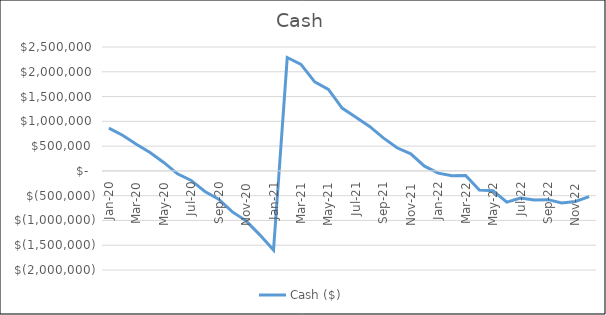
| Category | Cash ($) |
|---|---|
| 2020-01-01 | 863731.25 |
| 2020-02-29 | 720348.125 |
| 2020-03-31 | 537153.082 |
| 2020-04-30 | 370341.601 |
| 2020-05-31 | 171082.808 |
| 2020-06-30 | -59057.423 |
| 2020-07-31 | -192175.591 |
| 2020-08-31 | -415410.197 |
| 2020-09-30 | -570752.697 |
| 2020-10-31 | -827826.533 |
| 2020-11-30 | -1008120.83 |
| 2020-12-31 | -1290771.293 |
| 2021-01-31 | -1597181.941 |
| 2021-02-28 | 2288040.103 |
| 2021-03-31 | 2149328.491 |
| 2021-04-30 | 1795540.981 |
| 2021-05-31 | 1644915.37 |
| 2021-06-30 | 1268550.246 |
| 2021-07-31 | 1084684.936 |
| 2021-08-31 | 897273.376 |
| 2021-09-30 | 666786.01 |
| 2021-10-31 | 466385.581 |
| 2021-11-30 | 344854.527 |
| 2021-12-31 | 95363.286 |
| 2022-01-31 | -46367.467 |
| 2022-02-28 | -97598.677 |
| 2022-03-31 | -91387.279 |
| 2022-04-30 | -386813.538 |
| 2022-05-31 | -402299.072 |
| 2022-06-30 | -629901.044 |
| 2022-07-31 | -547071.522 |
| 2022-08-31 | -587703.473 |
| 2022-09-30 | -580454.106 |
| 2022-10-31 | -648898.884 |
| 2022-11-30 | -616610.623 |
| 2022-12-31 | -519792.593 |